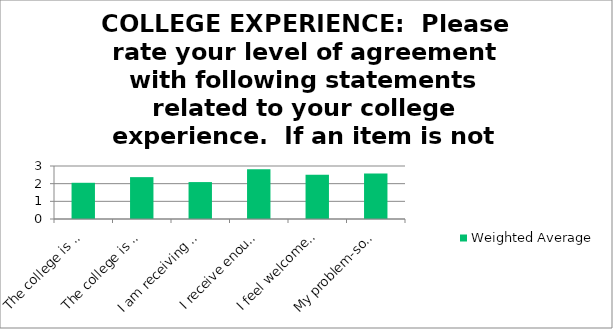
| Category | Weighted Average |
|---|---|
| The college is helping me meet my goals. | 2.05 |
| The college is preparing me for my career. | 2.37 |
| I am receiving an excellent education at the college. | 2.09 |
| I receive enough financial aid to support my goals. | 2.81 |
| I feel welcomed on campus. | 2.51 |
| My problem-solving skills have improved. | 2.58 |